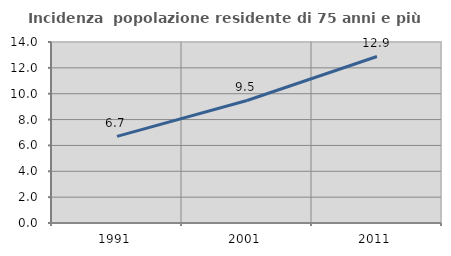
| Category | Incidenza  popolazione residente di 75 anni e più |
|---|---|
| 1991.0 | 6.702 |
| 2001.0 | 9.476 |
| 2011.0 | 12.88 |